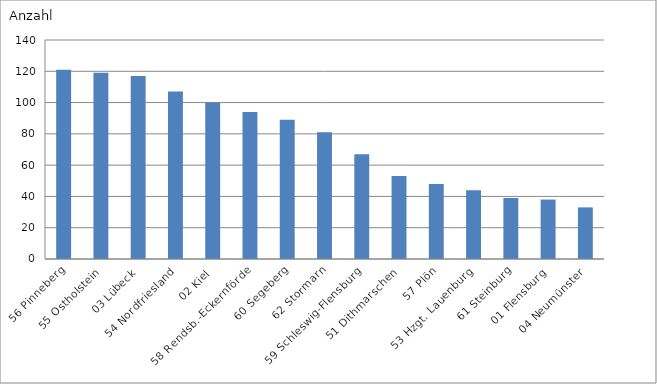
| Category | 56 Pinneberg |
|---|---|
| 56 Pinneberg | 121 |
| 55 Ostholstein | 119 |
| 03 Lübeck | 117 |
| 54 Nordfriesland | 107 |
| 02 Kiel | 100 |
| 58 Rendsb.-Eckernförde | 94 |
| 60 Segeberg | 89 |
| 62 Stormarn | 81 |
| 59 Schleswig-Flensburg | 67 |
| 51 Dithmarschen | 53 |
| 57 Plön | 48 |
| 53 Hzgt. Lauenburg | 44 |
| 61 Steinburg | 39 |
| 01 Flensburg | 38 |
| 04 Neumünster | 33 |